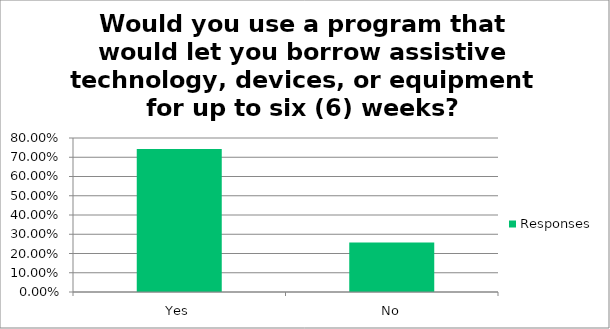
| Category | Responses |
|---|---|
| Yes | 0.742 |
| No | 0.258 |